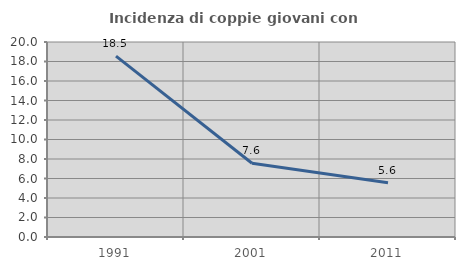
| Category | Incidenza di coppie giovani con figli |
|---|---|
| 1991.0 | 18.545 |
| 2001.0 | 7.56 |
| 2011.0 | 5.575 |